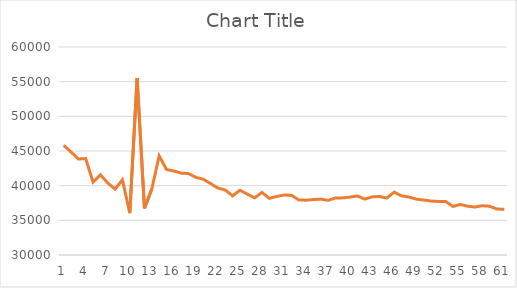
| Category | Series 0 |
|---|---|
| 0 | 45814.2 |
| 1 | 44862.7 |
| 2 | 43844.5 |
| 3 | 43906.9 |
| 4 | 40513.6 |
| 5 | 41569.3 |
| 6 | 40388.6 |
| 7 | 39500.4 |
| 8 | 40851 |
| 9 | 36030 |
| 10 | 55526.3 |
| 11 | 36724.8 |
| 12 | 39518.1 |
| 13 | 44298.2 |
| 14 | 42328.3 |
| 15 | 42118.8 |
| 16 | 41807.3 |
| 17 | 41751.6 |
| 18 | 41194.2 |
| 19 | 40940.5 |
| 20 | 40302.1 |
| 21 | 39655.5 |
| 22 | 39378.6 |
| 23 | 38527.2 |
| 24 | 39332 |
| 25 | 38787.2 |
| 26 | 38238.1 |
| 27 | 39026.8 |
| 28 | 38170 |
| 29 | 38450.9 |
| 30 | 38644.3 |
| 31 | 38623.2 |
| 32 | 37952 |
| 33 | 37901.5 |
| 34 | 37996.8 |
| 35 | 38055.4 |
| 36 | 37884.1 |
| 37 | 38219.4 |
| 38 | 38241.4 |
| 39 | 38354.4 |
| 40 | 38513.9 |
| 41 | 38060.6 |
| 42 | 38382.6 |
| 43 | 38439.6 |
| 44 | 38215.6 |
| 45 | 39061.7 |
| 46 | 38537.6 |
| 47 | 38364.1 |
| 48 | 38060.2 |
| 49 | 37931.7 |
| 50 | 37787.1 |
| 51 | 37723.8 |
| 52 | 37731.6 |
| 53 | 37004.6 |
| 54 | 37295.4 |
| 55 | 37034 |
| 56 | 36923 |
| 57 | 37107.4 |
| 58 | 37031.1 |
| 59 | 36628.2 |
| 60 | 36597.7 |